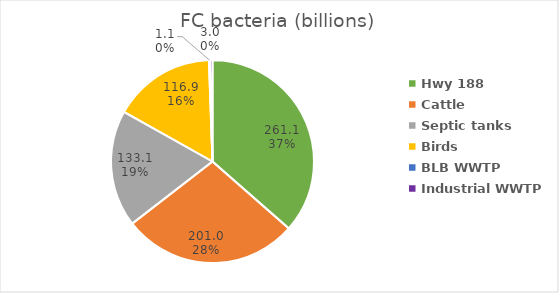
| Category | FC bacteria (billions) |
|---|---|
| Hwy 188 | 261.099 |
| Cattle | 201 |
| Septic tanks | 133.137 |
| Birds | 116.9 |
| BLB WWTP | 1.06 |
| Industrial WWTP | 2.99 |